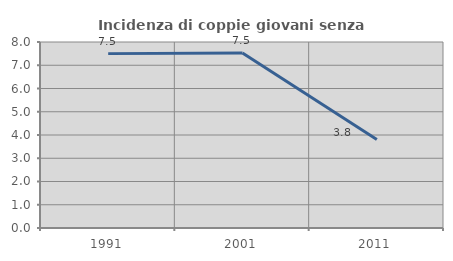
| Category | Incidenza di coppie giovani senza figli |
|---|---|
| 1991.0 | 7.5 |
| 2001.0 | 7.526 |
| 2011.0 | 3.803 |